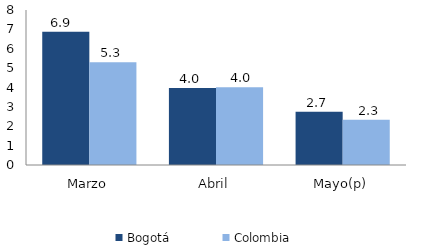
| Category | Bogotá | Colombia |
|---|---|---|
| Marzo | 6.876 | 5.302 |
| Abril | 3.972 | 4.011 |
| Mayo(p) | 2.747 | 2.333 |